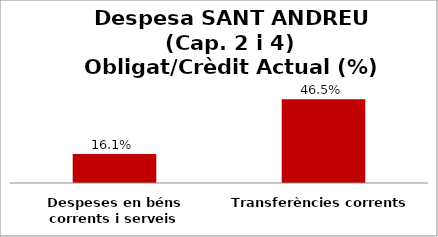
| Category | Series 0 |
|---|---|
| Despeses en béns corrents i serveis | 0.161 |
| Transferències corrents | 0.465 |